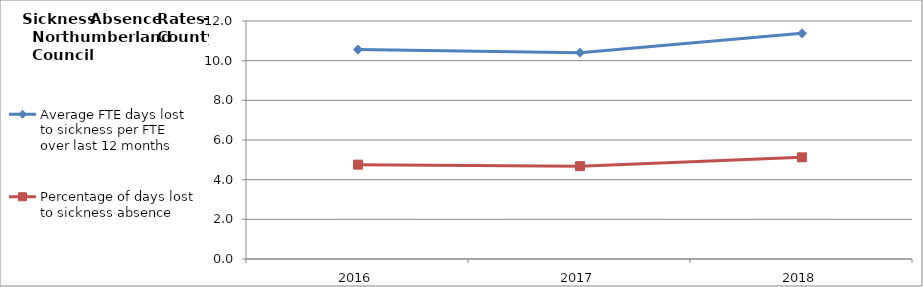
| Category | Average FTE days lost to sickness per FTE over last 12 months | Percentage of days lost to sickness absence |
|---|---|---|
| 2016.0 | 10.56 | 4.757 |
| 2017.0 | 10.4 | 4.683 |
| 2018.0 | 11.38 | 5.126 |